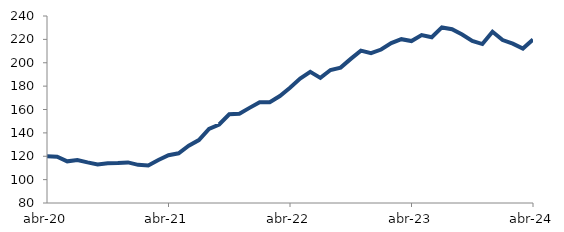
| Category | Series 0 |
|---|---|
| 2020-04-01 | 120.076 |
| 2020-05-01 | 119.592 |
| 2020-06-01 | 115.658 |
| 2020-07-01 | 116.729 |
| 2020-08-01 | 114.728 |
| 2020-09-01 | 113.012 |
| 2020-10-01 | 114.05 |
| 2020-11-01 | 114.24 |
| 2020-12-01 | 114.741 |
| 2021-01-01 | 112.625 |
| 2021-02-01 | 112.14 |
| 2021-03-01 | 116.74 |
| 2021-04-01 | 120.911 |
| 2021-05-01 | 122.536 |
| 2021-06-01 | 128.968 |
| 2021-07-01 | 133.864 |
| 2021-08-01 | 143.384 |
| 2021-09-01 | 147.196 |
| 2021-10-01 | 155.883 |
| 2021-11-01 | 156.426 |
| 2021-12-01 | 161.4 |
| 2022-01-01 | 166.276 |
| 2022-02-01 | 166.219 |
| 2022-03-01 | 171.531 |
| 2022-04-01 | 178.644 |
| 2022-05-01 | 186.465 |
| 2022-06-01 | 192.187 |
| 2022-07-01 | 187.044 |
| 2022-08-01 | 193.806 |
| 2022-09-01 | 195.846 |
| 2022-10-01 | 203.287 |
| 2022-11-01 | 210.344 |
| 2022-12-01 | 208.16 |
| 2023-01-01 | 211.29 |
| 2023-02-01 | 216.772 |
| 2023-03-01 | 220.156 |
| 2023-04-01 | 218.537 |
| 2023-05-01 | 223.702 |
| 2023-06-01 | 221.798 |
| 2023-07-01 | 230.236 |
| 2023-08-01 | 228.637 |
| 2023-09-01 | 224.175 |
| 2023-10-01 | 218.647 |
| 2023-11-01 | 215.985 |
| 2023-12-01 | 226.505 |
| 2024-01-01 | 219.392 |
| 2024-02-01 | 216.347 |
| 2024-03-01 | 212.111 |
| 2024-04-01 | 219.897 |